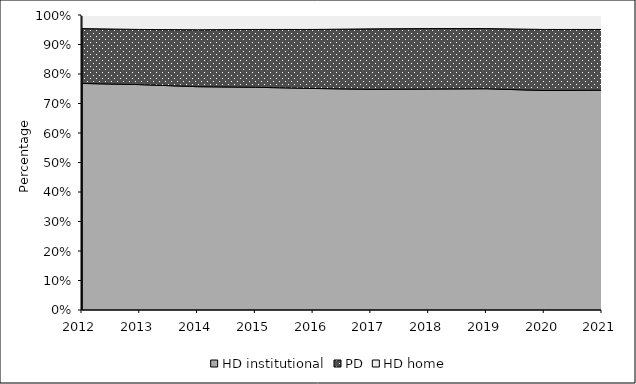
| Category | HD institutional  | PD | HD home |
|---|---|---|---|
| 2012.0 | 76.8 | 18.6 | 4.6 |
| 2013.0 | 76.4 | 18.7 | 5 |
| 2014.0 | 75.7 | 19.3 | 5 |
| 2015.0 | 75.5 | 19.6 | 4.8 |
| 2016.0 | 75.1 | 20 | 4.9 |
| 2017.0 | 74.8 | 20.5 | 4.7 |
| 2018.0 | 74.9 | 20.5 | 4.5 |
| 2019.0 | 75 | 20.4 | 4.7 |
| 2020.0 | 74.4 | 20.7 | 4.9 |
| 2021.0 | 74.5 | 20.6 | 5 |